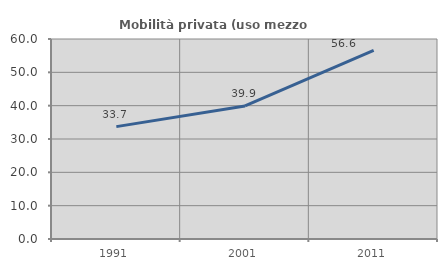
| Category | Mobilità privata (uso mezzo privato) |
|---|---|
| 1991.0 | 33.714 |
| 2001.0 | 39.927 |
| 2011.0 | 56.576 |